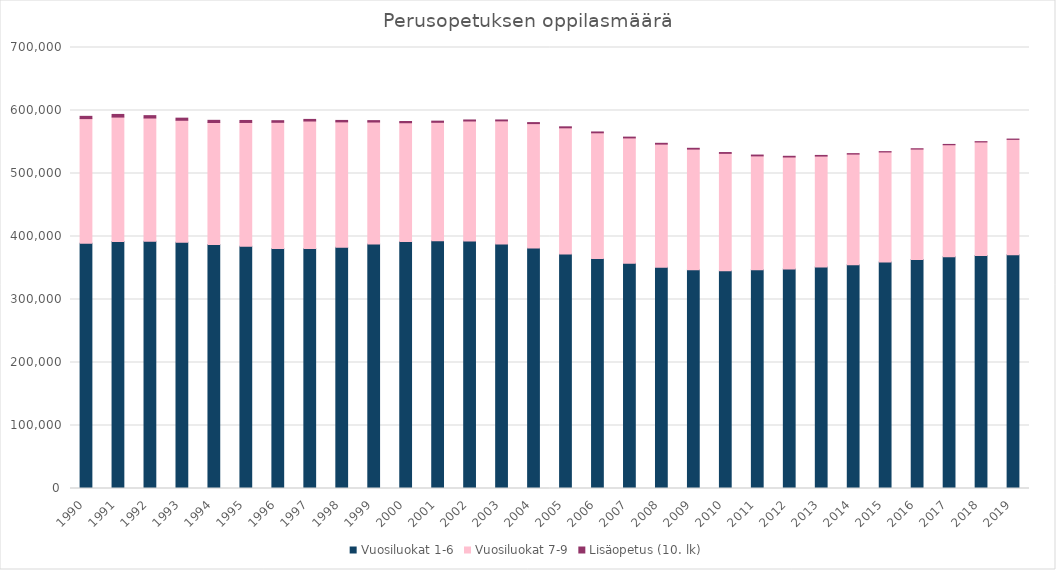
| Category | Vuosiluokat 1-6 | Vuosiluokat 7-9 | Lisäopetus (10. lk) |
|---|---|---|---|
| 1990.0 | 389410 | 197719 | 3602 |
| 1991.0 | 392059 | 197505 | 4193 |
| 1992.0 | 392537 | 195532 | 3777 |
| 1993.0 | 390892 | 193591 | 3369 |
| 1994.0 | 387306 | 193657 | 3434 |
| 1995.0 | 384369 | 196642 | 3178 |
| 1996.0 | 380932 | 200349 | 2554 |
| 1997.0 | 381078 | 202234 | 2543 |
| 1998.0 | 382746 | 199204 | 2289 |
| 1999.0 | 388063 | 193646 | 2236 |
| 2000.0 | 392150 | 188417 | 2003 |
| 2001.0 | 393267 | 187998 | 1849 |
| 2002.0 | 392741 | 190617 | 1605 |
| 2003.0 | 387934 | 195585 | 1461 |
| 2004.0 | 381785 | 197414 | 1614 |
| 2005.0 | 372128 | 200384 | 1593 |
| 2006.0 | 364902 | 199693 | 1353 |
| 2007.0 | 357403 | 199067 | 1294 |
| 2008.0 | 351095 | 195543 | 1295 |
| 2009.0 | 347060 | 191684 | 1263 |
| 2010.0 | 345615 | 186368 | 1294 |
| 2011.0 | 347245 | 180715 | 1332 |
| 2012.0 | 348432 | 177764 | 1124 |
| 2013.0 | 351663 | 176008 | 1030 |
| 2014.0 | 355139 | 175686 | 683 |
| 2015.0 | 359461 | 174724 | 504 |
| 2016.0 | 363450 | 175330 | 452 |
| 2017.0 | 368027 | 177607 | 526 |
| 2018.0 | 370020 | 180058 | 430 |
| 2019.0 | 371102 | 183063 | 490 |